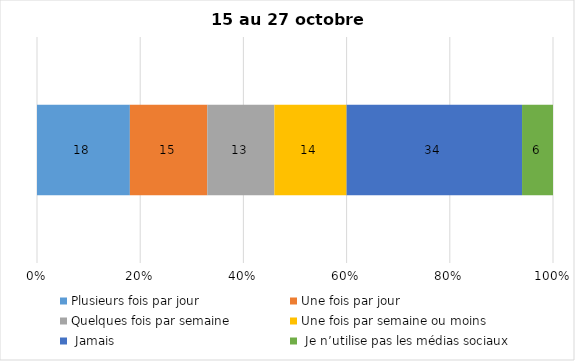
| Category | Plusieurs fois par jour | Une fois par jour | Quelques fois par semaine   | Une fois par semaine ou moins   |  Jamais   |  Je n’utilise pas les médias sociaux |
|---|---|---|---|---|---|---|
| 0 | 18 | 15 | 13 | 14 | 34 | 6 |